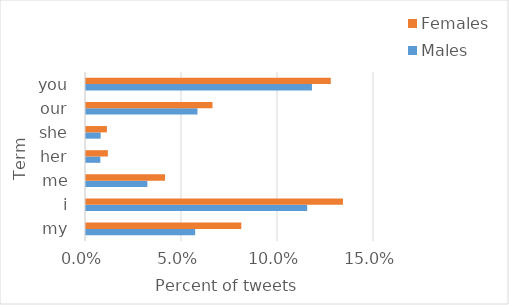
| Category | Males | Females |
|---|---|---|
| my | 0.057 | 0.081 |
| i | 0.115 | 0.134 |
| me | 0.032 | 0.041 |
| her | 0.007 | 0.011 |
| she | 0.008 | 0.011 |
| our | 0.058 | 0.066 |
| you | 0.118 | 0.127 |